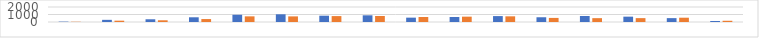
| Category | Series 0 | Series 1 |
|---|---|---|
| 7:00-8:00 | 48 | 32 |
| 8:00-9:00 | 288 | 176 |
| 9:00-10:00 | 364 | 228 |
| 10:00-11:00 | 628 | 392 |
| 11:00-12:00 | 964 | 752 |
| 12:00-13:00 | 1028 | 748 |
| 13:00-14:00 | 840 | 788 |
| 14:00-15:00 | 892 | 804 |
| 15:00-16:00 | 580 | 668 |
| 16:00-17:00 | 668 | 712 |
| 17:00-18:00 | 788 | 756 |
| 18:00-19:00 | 632 | 544 |
| 19:00-20:00 | 804 | 512 |
| 20:00-21:00 | 712 | 516 |
| 21:00-22:00 | 516 | 572 |
| 22:00-23:00 | 136 | 164 |